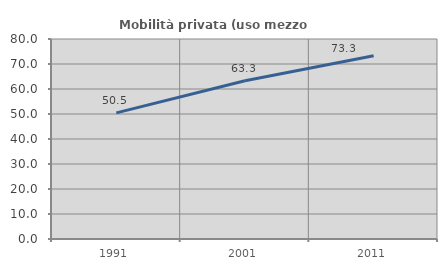
| Category | Mobilità privata (uso mezzo privato) |
|---|---|
| 1991.0 | 50.46 |
| 2001.0 | 63.271 |
| 2011.0 | 73.278 |